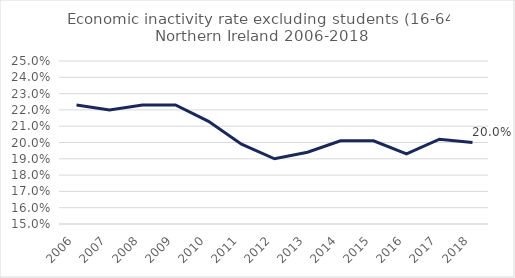
| Category | Series 0 |
|---|---|
| 2006 | 0.223 |
| 2007 | 0.22 |
| 2008 | 0.223 |
| 2009 | 0.223 |
| 2010 | 0.213 |
| 2011 | 0.199 |
| 2012 | 0.19 |
| 2013 | 0.194 |
| 2014 | 0.201 |
| 2015 | 0.201 |
| 2016 | 0.193 |
| 2017 | 0.202 |
| 2018 | 0.2 |